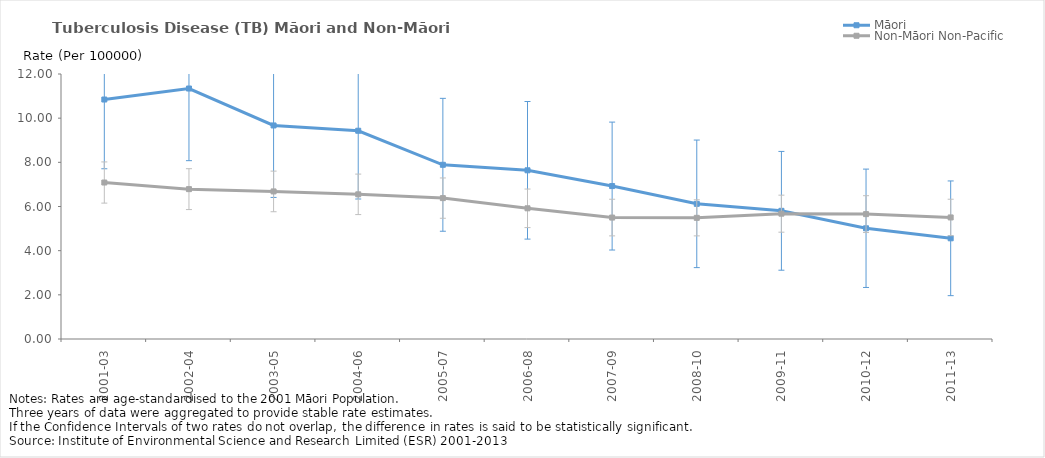
| Category | Māori | Non-Māori Non-Pacific |
|---|---|---|
| 2001-03 | 10.844 | 7.086 |
| 2002-04 | 11.343 | 6.786 |
| 2003-05 | 9.67 | 6.682 |
| 2004-06 | 9.43 | 6.55 |
| 2005-07 | 7.889 | 6.38 |
| 2006-08 | 7.639 | 5.918 |
| 2007-09 | 6.925 | 5.499 |
| 2008-10 | 6.121 | 5.487 |
| 2009-11 | 5.805 | 5.675 |
| 2010-12 | 5.014 | 5.655 |
| 2011-13 | 4.56 | 5.504 |